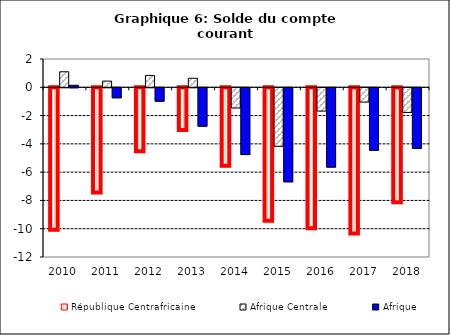
| Category | République Centrafricaine | Afrique Centrale | Afrique |
|---|---|---|---|
| 2010.0 | -10.151 | 1.095 | 0.144 |
| 2011.0 | -7.503 | 0.439 | -0.706 |
| 2012.0 | -4.585 | 0.839 | -0.95 |
| 2013.0 | -3.087 | 0.638 | -2.715 |
| 2014.0 | -5.616 | -1.429 | -4.722 |
| 2015.0 | -9.5 | -4.138 | -6.65 |
| 2016.0 | -10.04 | -1.65 | -5.608 |
| 2017.0 | -10.412 | -1.011 | -4.418 |
| 2018.0 | -8.193 | -1.744 | -4.278 |